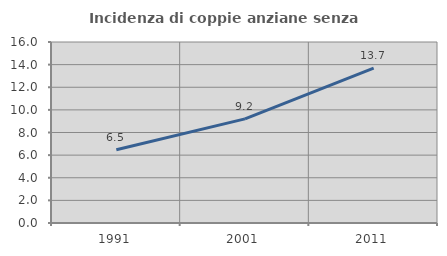
| Category | Incidenza di coppie anziane senza figli  |
|---|---|
| 1991.0 | 6.482 |
| 2001.0 | 9.204 |
| 2011.0 | 13.692 |